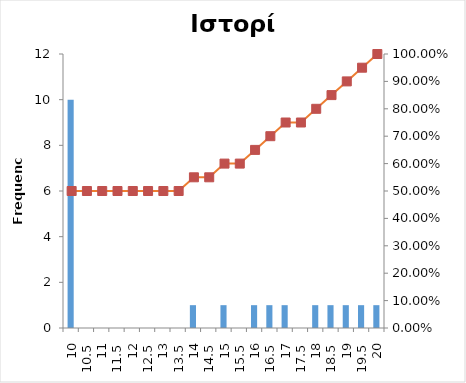
| Category | Series 0 |
|---|---|
| 10 | 10 |
| 10,5 | 0 |
| 11 | 0 |
| 11,5 | 0 |
| 12 | 0 |
| 12,5 | 0 |
| 13 | 0 |
| 13,5 | 0 |
| 14 | 1 |
| 14,5 | 0 |
| 15 | 1 |
| 15,5 | 0 |
| 16 | 1 |
| 16,5 | 1 |
| 17 | 1 |
| 17,5 | 0 |
| 18 | 1 |
| 18,5 | 1 |
| 19 | 1 |
| 19,5 | 1 |
| 20 | 1 |